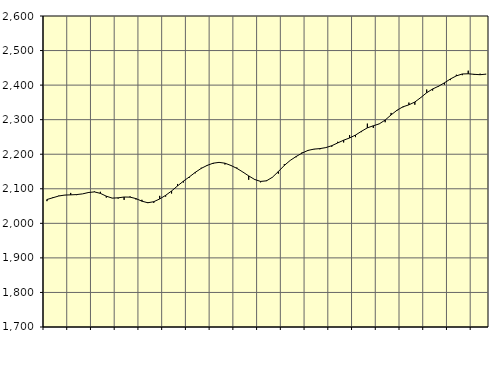
| Category | Piggar | Series 1 |
|---|---|---|
| nan | 2064.2 | 2068.97 |
| 1.0 | 2075.7 | 2074.08 |
| 1.0 | 2080.1 | 2079.1 |
| 1.0 | 2081.3 | 2081.82 |
| nan | 2088 | 2082.37 |
| 2.0 | 2081.6 | 2083.22 |
| 2.0 | 2085.2 | 2085.21 |
| 2.0 | 2087.8 | 2089.26 |
| nan | 2092.3 | 2090.95 |
| 3.0 | 2091.2 | 2086.73 |
| 3.0 | 2074.5 | 2078.58 |
| 3.0 | 2073.4 | 2072.97 |
| nan | 2071.7 | 2073.81 |
| 4.0 | 2067.8 | 2076.16 |
| 4.0 | 2077.8 | 2075.81 |
| 4.0 | 2069 | 2071.62 |
| nan | 2068.1 | 2064.11 |
| 5.0 | 2061.7 | 2059.54 |
| 5.0 | 2059.4 | 2062.64 |
| 5.0 | 2079.5 | 2070.58 |
| nan | 2077.3 | 2080.96 |
| 6.0 | 2086.3 | 2093.64 |
| 6.0 | 2113.9 | 2108.18 |
| 6.0 | 2118.3 | 2122.1 |
| nan | 2132.4 | 2134.39 |
| 7.0 | 2144.9 | 2147.58 |
| 7.0 | 2160.8 | 2158.97 |
| 7.0 | 2166.4 | 2167.66 |
| nan | 2171.9 | 2174.01 |
| 8.0 | 2176.8 | 2176.4 |
| 8.0 | 2170.3 | 2174.03 |
| 8.0 | 2168.4 | 2167.47 |
| nan | 2161.4 | 2159.15 |
| 9.0 | 2148.3 | 2148.66 |
| 9.0 | 2126.1 | 2137.26 |
| 9.0 | 2128 | 2126.98 |
| nan | 2118.7 | 2121.28 |
| 10.0 | 2124.3 | 2123.04 |
| 10.0 | 2133.9 | 2133.37 |
| 10.0 | 2143.7 | 2149.93 |
| nan | 2171.2 | 2167.48 |
| 11.0 | 2181.9 | 2182.09 |
| 11.0 | 2191.3 | 2193.44 |
| 11.0 | 2205.3 | 2203.34 |
| nan | 2210 | 2211.07 |
| 12.0 | 2214.2 | 2214.77 |
| 12.0 | 2214.3 | 2216.24 |
| 12.0 | 2218.9 | 2219.17 |
| nan | 2221.7 | 2224.67 |
| 13.0 | 2236 | 2232.62 |
| 13.0 | 2234.1 | 2240.58 |
| 13.0 | 2255.3 | 2247.01 |
| nan | 2249.5 | 2255.42 |
| 14.0 | 2264 | 2266.26 |
| 14.0 | 2288.5 | 2276.32 |
| 14.0 | 2276.1 | 2282.33 |
| nan | 2288.3 | 2287.76 |
| 15.0 | 2292.6 | 2298.92 |
| 15.0 | 2319.5 | 2313.77 |
| 15.0 | 2326.1 | 2327.36 |
| nan | 2335.9 | 2337.2 |
| 16.0 | 2349.4 | 2342.92 |
| 16.0 | 2343.3 | 2351.04 |
| 16.0 | 2363.2 | 2363.96 |
| nan | 2387.2 | 2377.93 |
| 17.0 | 2384.3 | 2388.83 |
| 17.0 | 2395.6 | 2396.83 |
| 17.0 | 2401.6 | 2406.73 |
| nan | 2414.5 | 2417.79 |
| 18.0 | 2430 | 2426.77 |
| 18.0 | 2428.8 | 2432.24 |
| 18.0 | 2441.7 | 2432.78 |
| nan | 2429.4 | 2431.22 |
| 19.0 | 2433 | 2430.16 |
| 19.0 | 2432.4 | 2431.74 |